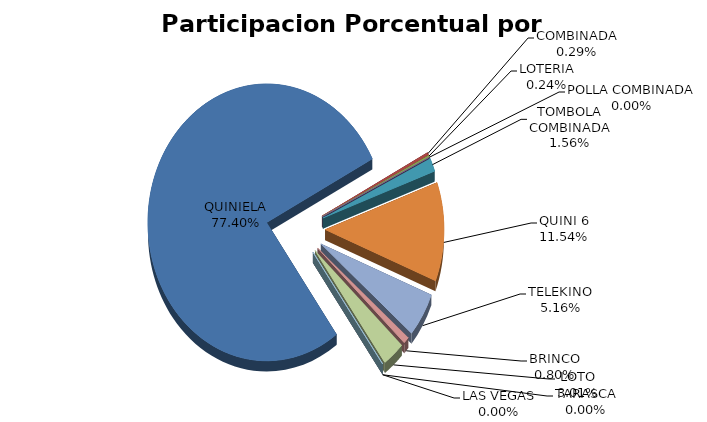
| Category | Series 0 |
|---|---|
| QUINIELA | 71527701 |
| COMBINADA | 270350 |
| LOTERIA | 218850 |
| POLLA COMBINADA | 0 |
| TOMBOLA COMBINADA | 1442460 |
| QUINI 6 | 10660382 |
| TELEKINO | 4765200 |
| BRINCO | 742380 |
| LOTO | 2783337 |
| TARASCA | 0 |
| LAS VEGAS | 0 |